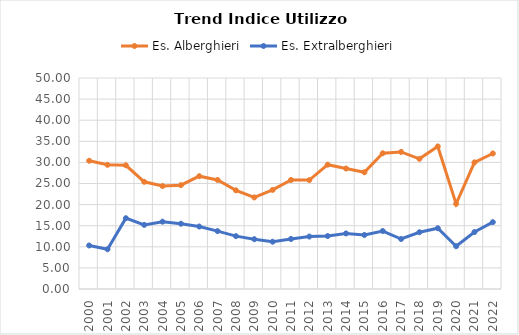
| Category | Es. Alberghieri | Es. Extralberghieri |
|---|---|---|
| 2000.0 | 30.39 | 10.316 |
| 2001.0 | 29.427 | 9.419 |
| 2002.0 | 29.318 | 16.779 |
| 2003.0 | 25.399 | 15.192 |
| 2004.0 | 24.404 | 15.953 |
| 2005.0 | 24.606 | 15.474 |
| 2006.0 | 26.737 | 14.805 |
| 2007.0 | 25.839 | 13.707 |
| 2008.0 | 23.377 | 12.529 |
| 2009.0 | 21.704 | 11.803 |
| 2010.0 | 23.479 | 11.208 |
| 2011.0 | 25.836 | 11.85 |
| 2012.0 | 25.805 | 12.433 |
| 2013.0 | 29.46 | 12.548 |
| 2014.0 | 28.545 | 13.163 |
| 2015.0 | 27.661 | 12.804 |
| 2016.0 | 32.164 | 13.74 |
| 2017.0 | 32.481 | 11.847 |
| 2018.0 | 30.845 | 13.452 |
| 2019.0 | 33.786 | 14.401 |
| 2020.0 | 20.181 | 10.132 |
| 2021.0 | 29.997 | 13.501 |
| 2022.0 | 32.114 | 15.843 |